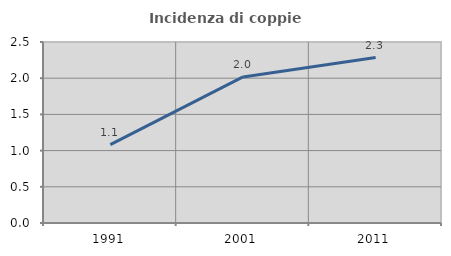
| Category | Incidenza di coppie miste |
|---|---|
| 1991.0 | 1.082 |
| 2001.0 | 2.017 |
| 2011.0 | 2.286 |